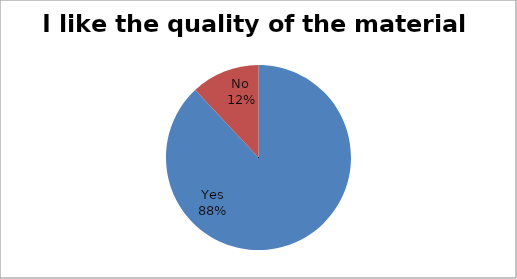
| Category | Series 0 |
|---|---|
| Yes | 22 |
| No  | 3 |